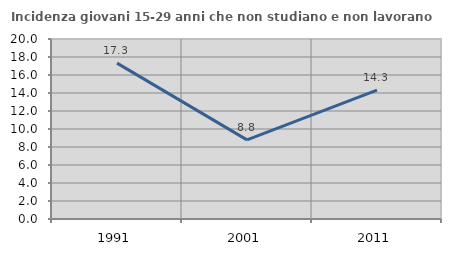
| Category | Incidenza giovani 15-29 anni che non studiano e non lavorano  |
|---|---|
| 1991.0 | 17.318 |
| 2001.0 | 8.79 |
| 2011.0 | 14.311 |